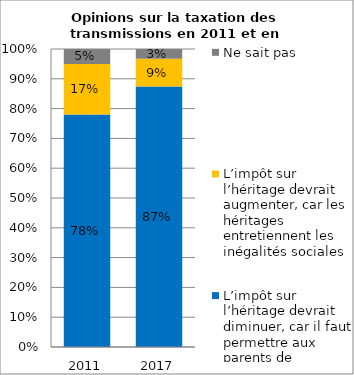
| Category | L’impôt sur l’héritage devrait diminuer, car il faut permettre aux parents de transmettre le plus de patrimoine possible à leurs enfants  | L’impôt sur l’héritage devrait augmenter, car les héritages entretiennent les inégalités sociales  | Ne sait pas |
|---|---|---|---|
| 2011.0 | 0.78 | 0.17 | 0.05 |
| 2017.0 | 0.874 | 0.093 | 0.033 |